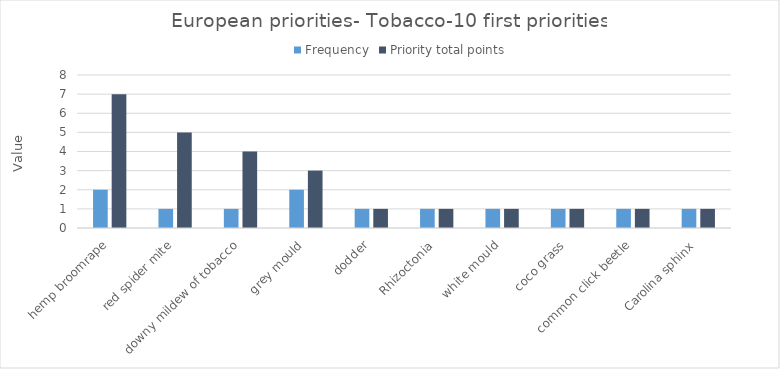
| Category | Frequency | Priority total points |
|---|---|---|
| hemp broomrape | 2 | 7 |
| red spider mite | 1 | 5 |
| downy mildew of tobacco | 1 | 4 |
| grey mould | 2 | 3 |
| dodder | 1 | 1 |
| Rhizoctonia | 1 | 1 |
| white mould | 1 | 1 |
| coco grass | 1 | 1 |
| common click beetle | 1 | 1 |
| Carolina sphinx | 1 | 1 |